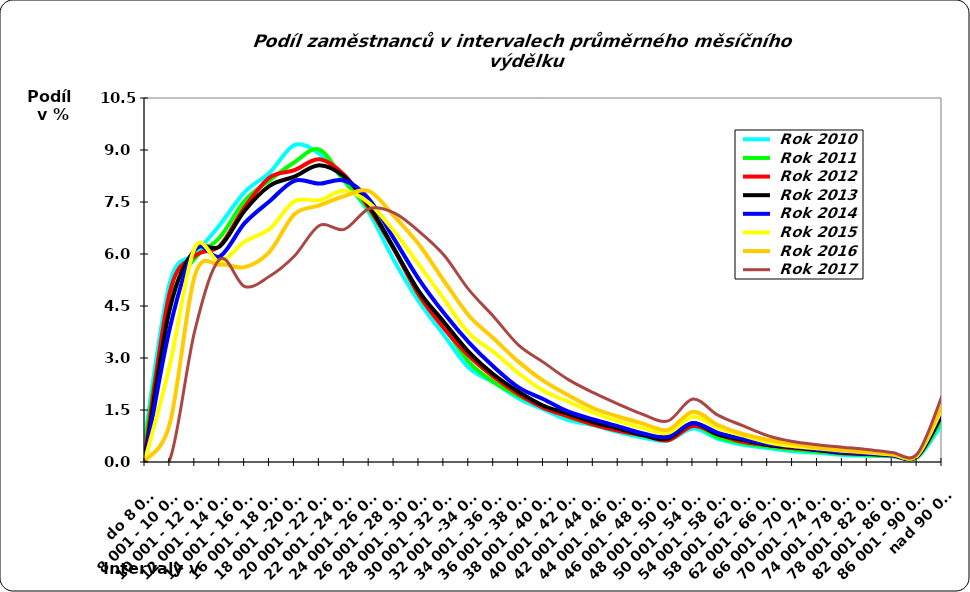
| Category |  Rok 2010 |  Rok 2011 |  Rok 2012 |  Rok 2013 |  Rok 2014 |  Rok 2015 |  Rok 2016 |  Rok 2017 |
|---|---|---|---|---|---|---|---|---|
| do 8 000 | 0.743 | 0.613 | 0.231 | 0.125 | 0.084 | 0.052 | 0.038 | 0.015 |
| 8 001 - 10 000 | 5.183 | 4.607 | 4.901 | 4.424 | 3.873 | 2.808 | 1.119 | 0.07 |
| 10 001 - 12 000 | 5.995 | 5.872 | 5.941 | 6.126 | 6.134 | 6.187 | 5.377 | 3.791 |
| 12 001 - 14 000 | 6.838 | 6.476 | 6.236 | 6.217 | 5.928 | 5.775 | 5.692 | 5.844 |
| 14 001 - 16 000 | 7.788 | 7.535 | 7.349 | 7.25 | 6.888 | 6.356 | 5.62 | 5.063 |
| 16 001 - 18 000 | 8.342 | 8.125 | 8.203 | 7.966 | 7.521 | 6.72 | 6.063 | 5.356 |
| 18 001  -20 000 | 9.138 | 8.648 | 8.417 | 8.234 | 8.112 | 7.52 | 7.146 | 5.942 |
| 20 001 - 22 000 | 8.885 | 9.014 | 8.733 | 8.561 | 8.03 | 7.553 | 7.401 | 6.823 |
| 22 001 - 24 000 | 8.113 | 8.106 | 8.278 | 8.233 | 8.12 | 7.821 | 7.668 | 6.71 |
| 24 001 - 26 000 | 7.183 | 7.277 | 7.322 | 7.392 | 7.581 | 7.468 | 7.813 | 7.305 |
| 26 001 - 28 000 | 5.815 | 6.161 | 6.122 | 6.154 | 6.437 | 6.654 | 7.095 | 7.186 |
| 28 001 - 30 000 | 4.628 | 4.802 | 4.819 | 4.925 | 5.269 | 5.692 | 6.275 | 6.654 |
| 30 001 - 32 000 | 3.66 | 3.897 | 3.859 | 4.04 | 4.296 | 4.704 | 5.229 | 5.969 |
| 32 001  -34 000 | 2.716 | 2.89 | 3.062 | 3.177 | 3.453 | 3.72 | 4.227 | 4.972 |
| 34 001 - 36 000 | 2.296 | 2.305 | 2.453 | 2.526 | 2.747 | 3.173 | 3.563 | 4.193 |
| 36 001 - 38 000 | 1.835 | 1.909 | 1.951 | 2.028 | 2.152 | 2.561 | 2.888 | 3.37 |
| 38 001 - 40 000 | 1.514 | 1.612 | 1.563 | 1.623 | 1.811 | 2.053 | 2.34 | 2.874 |
| 40 001 - 42 000 | 1.206 | 1.298 | 1.318 | 1.392 | 1.452 | 1.739 | 1.923 | 2.376 |
| 42 001 - 44 000 | 1.059 | 1.087 | 1.082 | 1.145 | 1.231 | 1.421 | 1.55 | 2 |
| 44 001 - 46 000 | 0.861 | 0.933 | 0.903 | 0.968 | 1.028 | 1.178 | 1.313 | 1.67 |
| 46 001 - 48 000 | 0.702 | 0.758 | 0.773 | 0.774 | 0.82 | 0.977 | 1.108 | 1.371 |
| 48 001 - 50 000 | 0.617 | 0.655 | 0.629 | 0.678 | 0.728 | 0.839 | 0.928 | 1.184 |
| 50 001 - 54 000 | 0.966 | 1.05 | 1.039 | 1.115 | 1.128 | 1.307 | 1.448 | 1.816 |
| 54 001 - 58 000 | 0.668 | 0.719 | 0.8 | 0.797 | 0.839 | 0.985 | 1.067 | 1.351 |
| 58 001 - 62 000 | 0.496 | 0.548 | 0.58 | 0.637 | 0.669 | 0.767 | 0.807 | 1.048 |
| 62 001 - 66 000 | 0.405 | 0.443 | 0.493 | 0.492 | 0.52 | 0.572 | 0.643 | 0.761 |
| 66 001 - 70 000 | 0.307 | 0.36 | 0.401 | 0.424 | 0.443 | 0.458 | 0.53 | 0.59 |
| 70 001 - 74 000 | 0.268 | 0.302 | 0.341 | 0.347 | 0.357 | 0.391 | 0.416 | 0.501 |
| 74 001 - 78 000 | 0.203 | 0.237 | 0.259 | 0.263 | 0.281 | 0.328 | 0.341 | 0.428 |
| 78 001 - 82 000 | 0.182 | 0.198 | 0.229 | 0.237 | 0.245 | 0.276 | 0.293 | 0.36 |
| 82 001 - 86 000 | 0.164 | 0.183 | 0.189 | 0.195 | 0.196 | 0.215 | 0.234 | 0.273 |
| 86 001 - 90 000 | 0.133 | 0.142 | 0.166 | 0.16 | 0.179 | 0.188 | 0.196 | 0.232 |
| nad 90 001 | 1.092 | 1.24 | 1.361 | 1.375 | 1.45 | 1.544 | 1.652 | 1.903 |